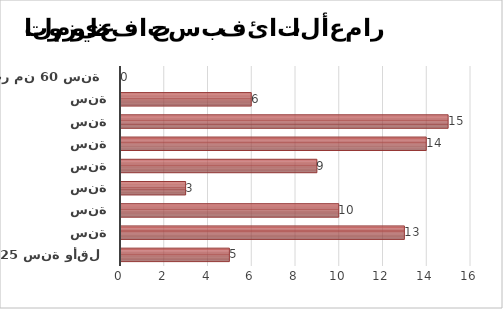
| Category | Series 1 |
|---|---|
| 25 سنة وأقل | 5 |
| ما بين 26 و30 سنة | 13 |
| ما بين 31 و35 سنة | 10 |
| ما بين 36 و40 سنة | 3 |
| ما بين 41 و45 سنة | 9 |
| ما بين 46 و50 سنة | 14 |
| ما بين 51 و55 سنة | 15 |
| ما بين 56 و60 سنة | 6 |
| أكثر من 60 سنة | 0 |